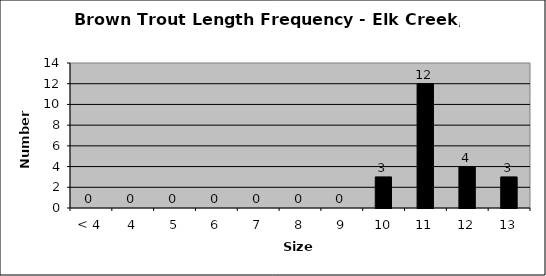
| Category | Series 0 |
|---|---|
| < 4 | 0 |
| 4 | 0 |
| 5 | 0 |
| 6 | 0 |
| 7 | 0 |
| 8 | 0 |
| 9 | 0 |
| 10 | 3 |
| 11 | 12 |
| 12 | 4 |
| 13 | 3 |